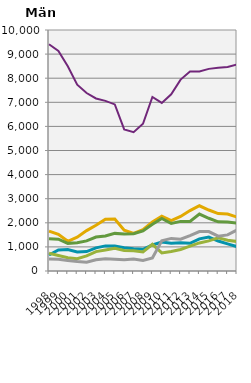
| Category | Civilingenjörsexamen | Sjuksköterskeexamen | Juristexamen | Socionomexamen | Psykologexamen | Läkarexamen |
|---|---|---|---|---|---|---|
| 1998.0 | 9411 | 665 | 1657 | 733 | 503 | 1336 |
| 1999.0 | 9133 | 872 | 1519 | 644 | 489 | 1319 |
| 2000.0 | 8496 | 891 | 1234 | 551 | 439 | 1147 |
| 2001.0 | 7729 | 790 | 1402 | 508 | 396 | 1175 |
| 2002.0 | 7384 | 808 | 1675 | 626 | 368 | 1248 |
| 2003.0 | 7159 | 961 | 1896 | 804 | 464 | 1407 |
| 2004.0 | 7060 | 1042 | 2147 | 875 | 504 | 1450 |
| 2005.0 | 6912 | 1035 | 2159 | 942 | 490 | 1561 |
| 2006.0 | 5878 | 966 | 1691 | 848 | 471 | 1540 |
| 2007.0 | 5761 | 928 | 1563 | 844 | 500 | 1544 |
| 2008.0 | 6111 | 901 | 1714 | 792 | 437 | 1661 |
| 2009.0 | 7223 | 1081 | 2030 | 1107 | 538 | 1936 |
| 2010.0 | 6976 | 1201 | 2275 | 750 | 1255 | 2183 |
| 2011.0 | 7330 | 1153 | 2090 | 812 | 1352 | 1970 |
| 2012.0 | 7942 | 1174 | 2262 | 891 | 1318 | 2059 |
| 2013.0 | 8276 | 1150 | 2507 | 1029 | 1470 | 2055 |
| 2014.0 | 8282 | 1333 | 2706 | 1165 | 1635 | 2361 |
| 2015.0 | 8387 | 1405 | 2531 | 1248 | 1635 | 2188 |
| 2016.0 | 8430 | 1244 | 2381 | 1374 | 1445 | 2042 |
| 2017.0 | 8465 | 1127 | 2364 | 1273 | 1498 | 2030 |
| 2018.0 | 8566 | 1009 | 2238 | 1224 | 1701 | 1985 |